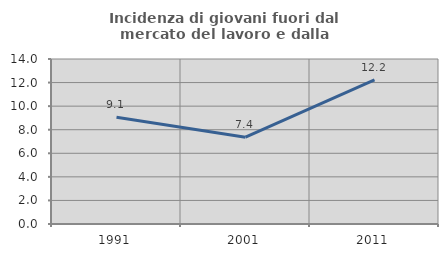
| Category | Incidenza di giovani fuori dal mercato del lavoro e dalla formazione  |
|---|---|
| 1991.0 | 9.063 |
| 2001.0 | 7.362 |
| 2011.0 | 12.222 |